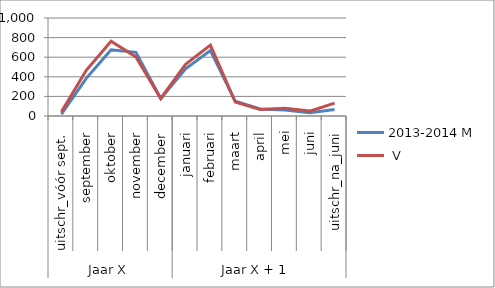
| Category | 2013-2014 |
|---|---|
| 0 | 42 |
| 1 | 466 |
| 2 | 763 |
| 3 | 603 |
| 4 | 179 |
| 5 | 527 |
| 6 | 723 |
| 7 | 143 |
| 8 | 67 |
| 9 | 80 |
| 10 | 50 |
| 11 | 131 |